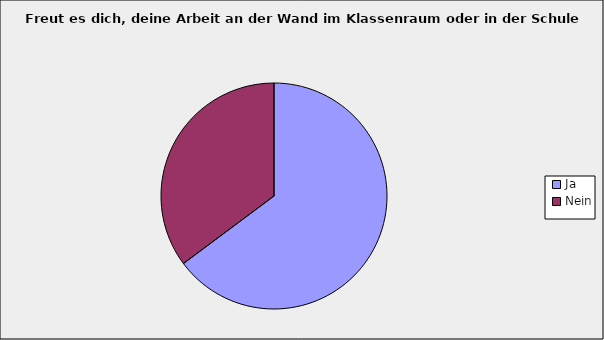
| Category | Series 0 |
|---|---|
| Ja | 0.648 |
| Nein | 0.352 |